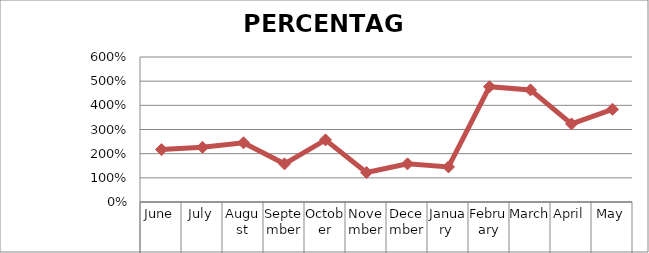
| Category | PERCENTAGE |
|---|---|
| June | 2.169 |
| July | 2.263 |
| August | 2.452 |
| September | 1.579 |
| October | 2.57 |
| November | 1.219 |
| December | 1.579 |
| January  | 1.452 |
| February | 4.77 |
| March | 4.637 |
| April | 3.231 |
| May | 3.837 |